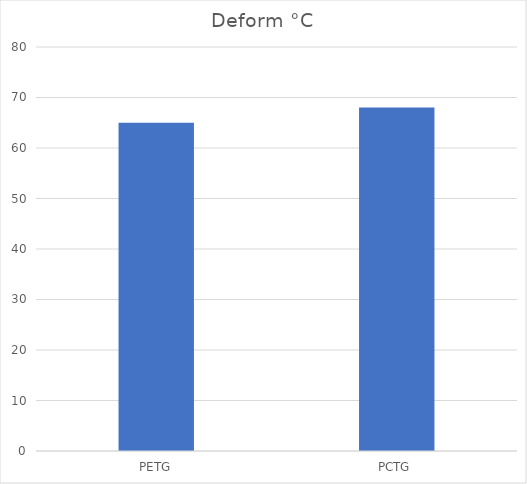
| Category | Deform °C |
|---|---|
| PETG | 65 |
| PCTG | 68 |